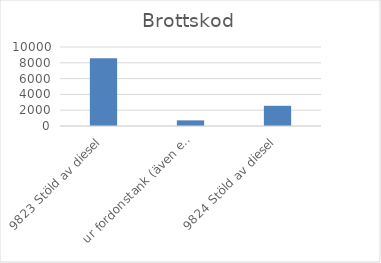
| Category | Summa |
|---|---|
| 9823 Stöld av diesel, ur fordonstank (även entreprenadmaskin m.m.) | 8579 |
| 9824 Stöld av diesel, ur större tankar (ej kopplade till fordon) | 713 |
| 9825 Stöld av drivmedel (även diesel), ej genom smitning | 2557 |